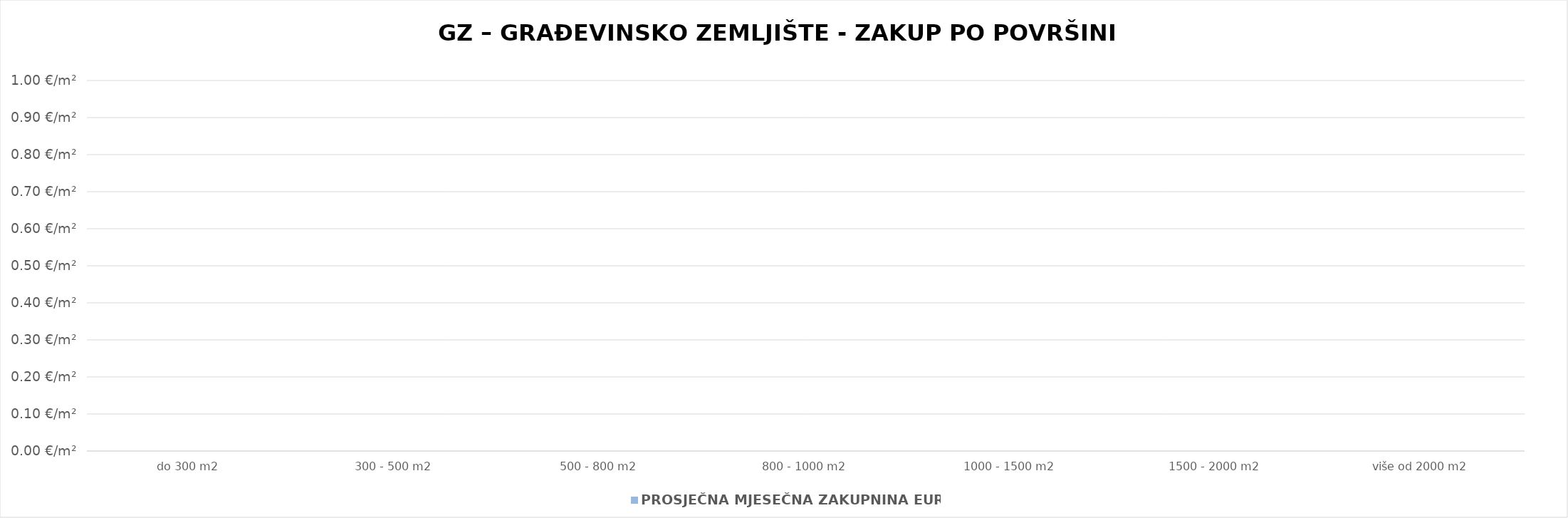
| Category | PROSJEČNA MJESEČNA ZAKUPNINA EUR/m2 |
|---|---|
| do 300 m2 | 0 |
| 300 - 500 m2 | 0 |
| 500 - 800 m2 | 0 |
| 800 - 1000 m2 | 0 |
| 1000 - 1500 m2 | 0 |
| 1500 - 2000 m2 | 0 |
| više od 2000 m2 | 0 |